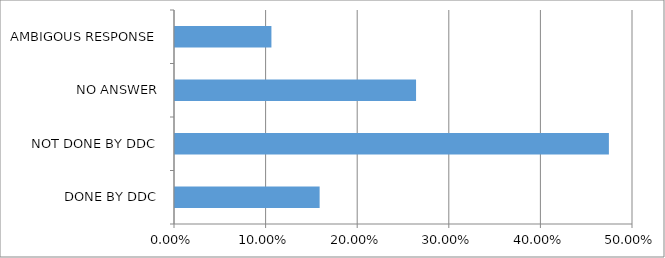
| Category | Series 0 |
|---|---|
| DONE BY DDC | 0.158 |
| NOT DONE BY DDC | 0.474 |
| NO ANSWER | 0.263 |
| AMBIGOUS RESPONSE | 0.105 |